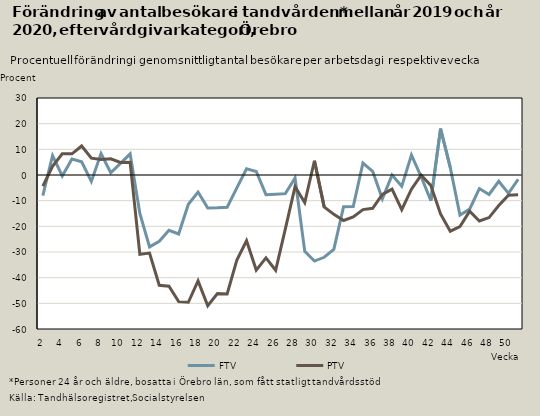
| Category | FTV | PTV |
|---|---|---|
| 2.0 | -8.025 | -4.326 |
| 3.0 | 7.559 | 3.412 |
| 4.0 | -0.374 | 8.292 |
| 5.0 | 6.197 | 8.247 |
| 6.0 | 5.155 | 11.306 |
| 7.0 | -2.527 | 6.546 |
| 8.0 | 8.361 | 6.066 |
| 9.0 | 0.888 | 6.326 |
| 10.0 | 4.505 | 4.883 |
| 11.0 | 8.226 | 4.93 |
| 12.0 | -14.949 | -30.894 |
| 13.0 | -28.017 | -30.409 |
| 14.0 | -25.824 | -42.962 |
| 15.0 | -21.559 | -43.353 |
| 16.0 | -22.983 | -49.34 |
| 17.0 | -11.388 | -49.576 |
| 18.0 | -6.642 | -41.239 |
| 19.0 | -12.894 | -50.931 |
| 20.0 | -12.803 | -46.22 |
| 21.0 | -12.559 | -46.33 |
| 22.0 | -5 | -33.183 |
| 23.0 | 2.394 | -25.616 |
| 24.0 | 1.383 | -37.045 |
| 25.0 | -7.649 | -32.266 |
| 26.0 | -7.467 | -37.126 |
| 27.0 | -7.27 | -21.013 |
| 28.0 | -1.186 | -4.541 |
| 29.0 | -29.739 | -10.721 |
| 30.0 | -33.539 | 5.556 |
| 31.0 | -32.056 | -12.403 |
| 32.0 | -28.996 | -15.334 |
| 33.0 | -12.386 | -17.717 |
| 34.0 | -12.276 | -16.354 |
| 35.0 | 4.67 | -13.471 |
| 36.0 | 1.454 | -12.973 |
| 37.0 | -9.295 | -7.572 |
| 38.0 | -0.046 | -5.515 |
| 39.0 | -4.414 | -13.495 |
| 40.0 | 7.784 | -5.539 |
| 41.0 | -0.676 | -0.063 |
| 42.0 | -10.004 | -4.061 |
| 43.0 | 18.08 | -15.184 |
| 44.0 | 2.955 | -21.9 |
| 45.0 | -15.586 | -20.064 |
| 46.0 | -13.301 | -14.112 |
| 47.0 | -5.279 | -17.93 |
| 48.0 | -7.595 | -16.594 |
| 49.0 | -2.458 | -11.92 |
| 50.0 | -7.143 | -7.889 |
| 51.0 | -1.714 | -7.72 |